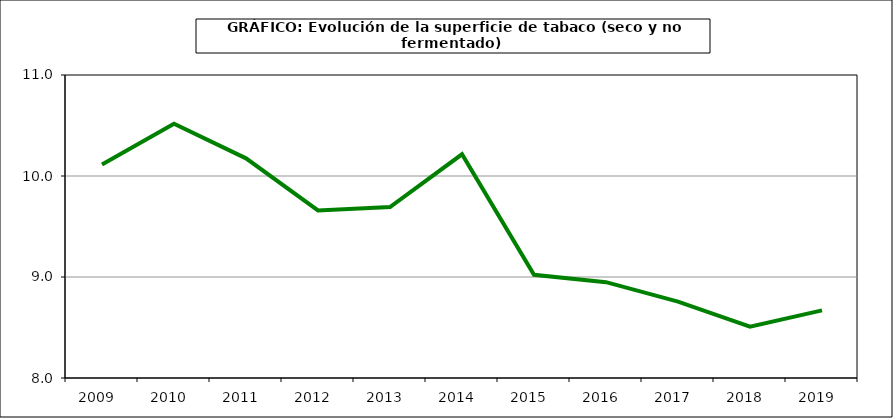
| Category | Superficie |
|---|---|
| 2009.0 | 10.115 |
| 2010.0 | 10.517 |
| 2011.0 | 10.175 |
| 2012.0 | 9.659 |
| 2013.0 | 9.693 |
| 2014.0 | 10.215 |
| 2015.0 | 9.022 |
| 2016.0 | 8.949 |
| 2017.0 | 8.756 |
| 2018.0 | 8.509 |
| 2019.0 | 8.67 |